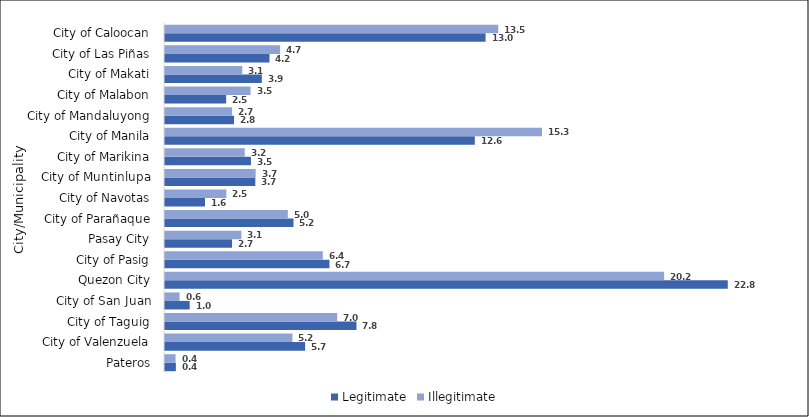
| Category | Legitimate | Illegitimate |
|---|---|---|
| Pateros | 0.441 | 0.428 |
| City of Valenzuela | 5.676 | 5.163 |
| City of Taguig | 7.758 | 6.978 |
| City of San Juan | 1 | 0.589 |
| Quezon City | 22.803 | 20.223 |
| City of Pasig | 6.663 | 6.394 |
| Pasay City | 2.716 | 3.095 |
| City of Parañaque | 5.206 | 4.977 |
| City of Navotas | 1.621 | 2.487 |
| City of Muntinlupa | 3.66 | 3.674 |
| City of Marikina | 3.482 | 3.232 |
| City of Manila | 12.553 | 15.277 |
| City of Mandaluyong | 2.799 | 2.719 |
| City of Malabon | 2.478 | 3.466 |
| City of Makati | 3.923 | 3.133 |
| City of Las Piñas | 4.233 | 4.665 |
| City of Caloocan | 12.989 | 13.502 |